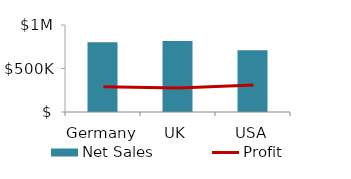
| Category | Net Sales |
|---|---|
| Germany | 802135 |
| UK | 816308 |
| USA | 711079 |